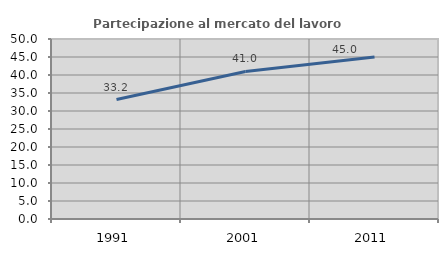
| Category | Partecipazione al mercato del lavoro  femminile |
|---|---|
| 1991.0 | 33.178 |
| 2001.0 | 40.991 |
| 2011.0 | 45.026 |